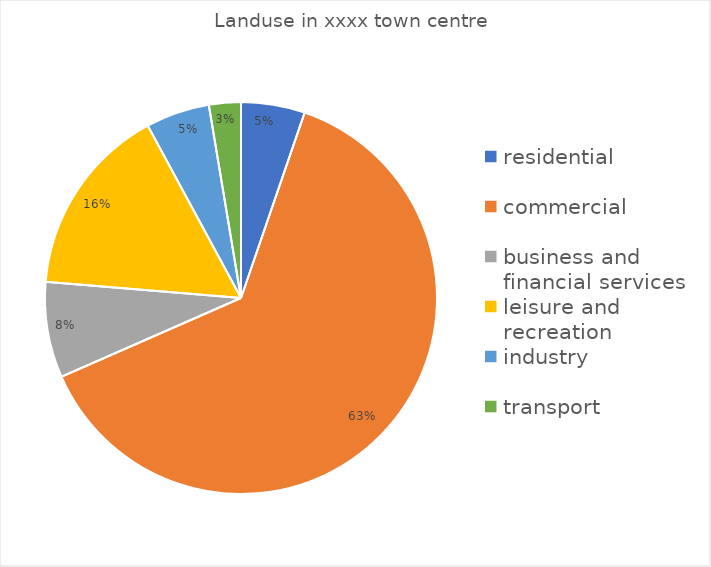
| Category | Total  |
|---|---|
| residential | 2 |
| commercial  | 24 |
| business and financial services | 3 |
| leisure and recreation | 6 |
| industry  | 2 |
| transport | 1 |